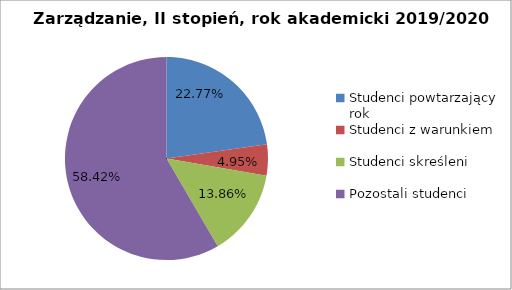
| Category | Series 0 |
|---|---|
| Studenci powtarzający rok | 23 |
| Studenci z warunkiem | 5 |
| Studenci skreśleni | 14 |
| Pozostali studenci | 59 |